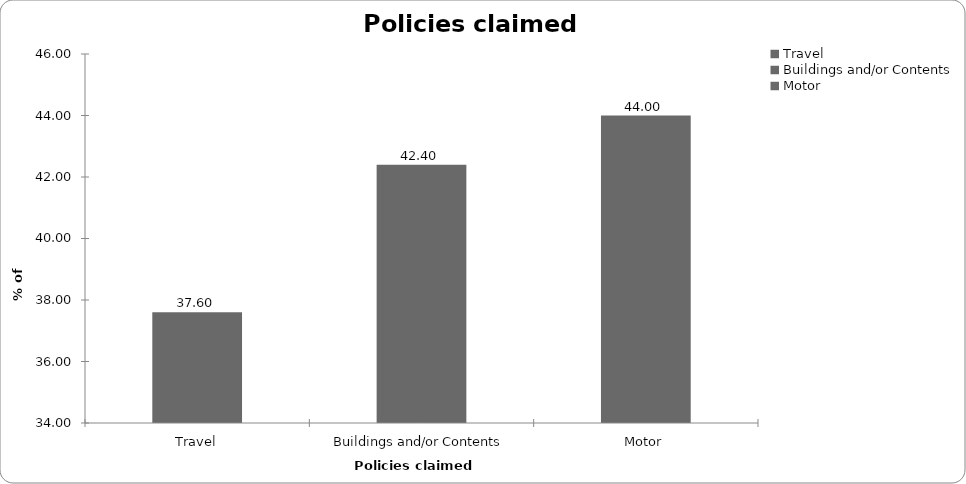
| Category | Policies claimed on |
|---|---|
| Travel | 37.6 |
| Buildings and/or Contents | 42.4 |
| Motor | 44 |